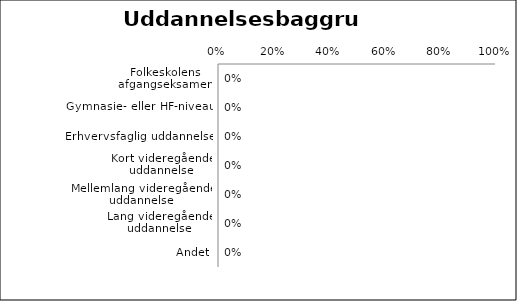
| Category | Uddannelsesbaggrund |
|---|---|
| Folkeskolens afgangseksamen | 0 |
| Gymnasie- eller HF-niveau | 0 |
| Erhvervsfaglig uddannelse | 0 |
| Kort videregående uddannelse | 0 |
| Mellemlang videregående uddannelse | 0 |
| Lang videregående uddannelse | 0 |
| Andet | 0 |